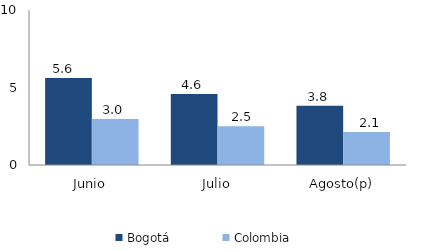
| Category | Bogotá | Colombia |
|---|---|---|
| Junio | 5.618 | 2.968 |
| Julio | 4.587 | 2.493 |
| Agosto(p) | 3.815 | 2.136 |